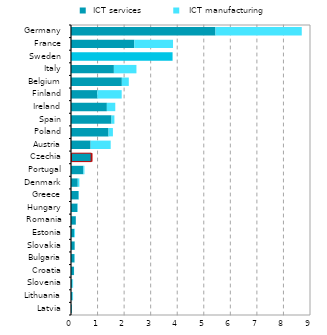
| Category |  ICT services  |   ICT manufacturing |
|---|---|---|
| Latvia | 0.031 | 0.004 |
| Lithuania | 0.056 | 0.021 |
| Slovenia | 0.051 | 0.029 |
| Croatia | 0.111 | 0.004 |
| Bulgaria | 0.132 | 0.007 |
| Slovakia | 0.138 | 0.004 |
| Estonia | 0.118 | 0.033 |
| Romania | 0.182 | 0.002 |
| Hungary | 0.241 | 0.014 |
| Greece | 0.288 | 0.011 |
| Denmark | 0.255 | 0.061 |
| Portugal | 0.466 | 0.04 |
| Czechia | 0.759 | 0.028 |
| Austria | 0.739 | 0.756 |
| Poland | 1.414 | 0.165 |
| Spain | 1.525 | 0.109 |
| Ireland | 1.351 | 0.317 |
| Finland | 0.989 | 0.921 |
| Belgium | 1.915 | 0.262 |
| Italy | 1.615 | 0.85 |
| Sweden | 3.825 | 0 |
| France | 2.383 | 1.459 |
| Germany | 5.441 | 3.25 |